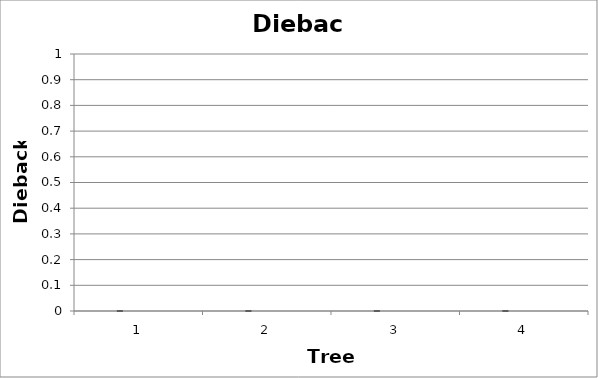
| Category | Series 0 | Experts |
|---|---|---|
| 0 | 0 |  |
| 1 | 0 |  |
| 2 | 0 |  |
| 3 | 0 |  |